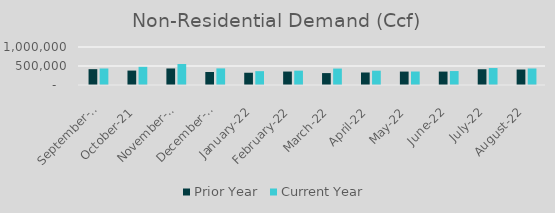
| Category | Prior Year | Current Year |
|---|---|---|
| 2021-09-01 | 416886.629 | 434192.442 |
| 2021-10-01 | 379515 | 477878.526 |
| 2021-11-01 | 434815 | 552599.698 |
| 2021-12-01 | 342584.594 | 436956.784 |
| 2022-01-01 | 322657.16 | 364164.019 |
| 2022-02-01 | 354041 | 377149.369 |
| 2022-03-01 | 313343 | 432270.798 |
| 2022-04-01 | 329084.722 | 376255.784 |
| 2022-05-01 | 353085 | 354792 |
| 2022-06-01 | 353141.442 | 367009.666 |
| 2022-07-01 | 414577.112 | 446288 |
| 2022-08-01 | 407774.995 | 434730.757 |